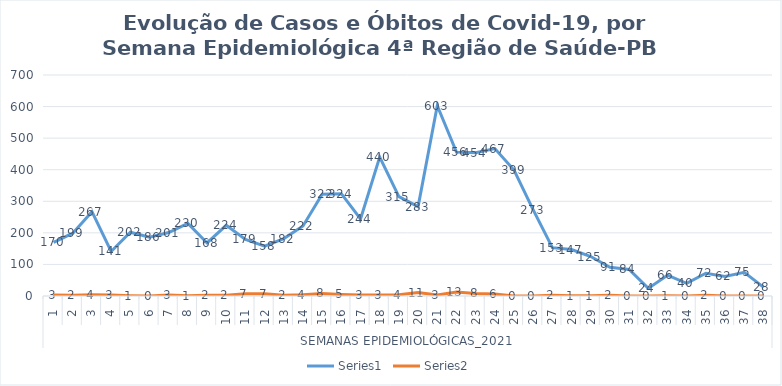
| Category | Series 0 | Series 1 |
|---|---|---|
| 0 | 170 | 3 |
| 1 | 199 | 2 |
| 2 | 267 | 4 |
| 3 | 141 | 3 |
| 4 | 202 | 1 |
| 5 | 186 | 0 |
| 6 | 201 | 3 |
| 7 | 230 | 1 |
| 8 | 168 | 2 |
| 9 | 224 | 2 |
| 10 | 179 | 7 |
| 11 | 158 | 7 |
| 12 | 182 | 2 |
| 13 | 222 | 4 |
| 14 | 322 | 8 |
| 15 | 324 | 5 |
| 16 | 244 | 3 |
| 17 | 440 | 3 |
| 18 | 315 | 4 |
| 19 | 283 | 11 |
| 20 | 603 | 3 |
| 21 | 456 | 13 |
| 22 | 454 | 8 |
| 23 | 467 | 6 |
| 24 | 399 | 0 |
| 25 | 273 | 0 |
| 26 | 153 | 2 |
| 27 | 147 | 1 |
| 28 | 125 | 1 |
| 29 | 91 | 2 |
| 30 | 84 | 0 |
| 31 | 24 | 0 |
| 32 | 66 | 1 |
| 33 | 40 | 0 |
| 34 | 72 | 2 |
| 35 | 62 | 0 |
| 36 | 75 | 0 |
| 37 | 28 | 0 |